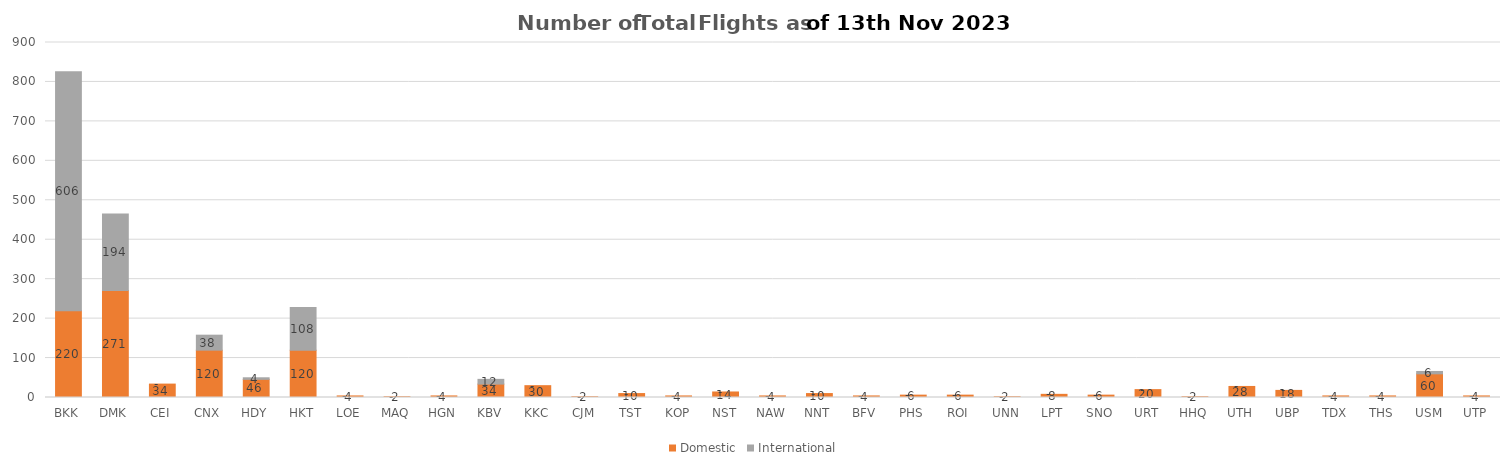
| Category | Domestic | International |
|---|---|---|
| BKK | 220 | 606 |
| DMK | 271 | 194 |
| CEI | 34 | 0 |
| CNX | 120 | 38 |
| HDY | 46 | 4 |
| HKT | 120 | 108 |
| LOE | 4 | 0 |
| MAQ | 2 | 0 |
| HGN | 4 | 0 |
| KBV | 34 | 12 |
| KKC | 30 | 0 |
| CJM | 2 | 0 |
| TST | 10 | 0 |
| KOP | 4 | 0 |
| NST | 14 | 0 |
| NAW | 4 | 0 |
| NNT | 10 | 0 |
| BFV | 4 | 0 |
| PHS | 6 | 0 |
| ROI | 6 | 0 |
| UNN | 2 | 0 |
| LPT | 8 | 0 |
| SNO | 6 | 0 |
| URT | 20 | 0 |
| HHQ | 2 | 0 |
| UTH | 28 | 0 |
| UBP | 18 | 0 |
| TDX | 4 | 0 |
| THS | 4 | 0 |
| USM | 60 | 6 |
| UTP | 4 | 0 |